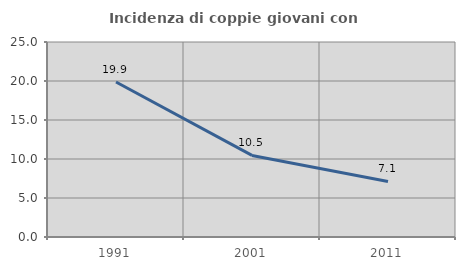
| Category | Incidenza di coppie giovani con figli |
|---|---|
| 1991.0 | 19.876 |
| 2001.0 | 10.458 |
| 2011.0 | 7.12 |